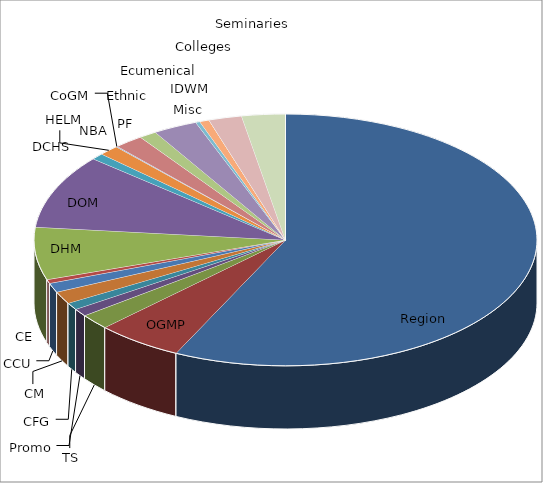
| Category | Series 0 |
|---|---|
| Region | 242.962 |
| OGMP | 23.775 |
| TS | 8.383 |
| Promo | 4.182 |
| CFG | 3.849 |
| CM | 6.711 |
| CCU | 5.085 |
| CE | 2.121 |
| DHM | 28.64 |
| DOM | 40.409 |
| DCHS | 3.417 |
| HELM | 5.552 |
| CoGM | 0.368 |
| NBA | 7.922 |
| PF | 4.811 |
| Ethnic | 12.104 |
| Ecumenical | 1.17 |
| Misc | 2.636 |
| IDWM | 0 |
| Colleges | 9.03 |
| Seminaries | 11.872 |